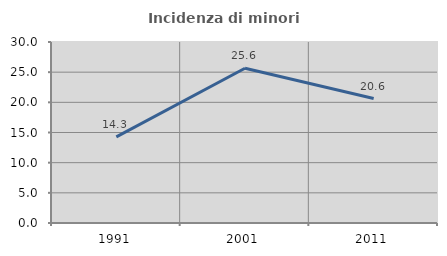
| Category | Incidenza di minori stranieri |
|---|---|
| 1991.0 | 14.286 |
| 2001.0 | 25.641 |
| 2011.0 | 20.628 |